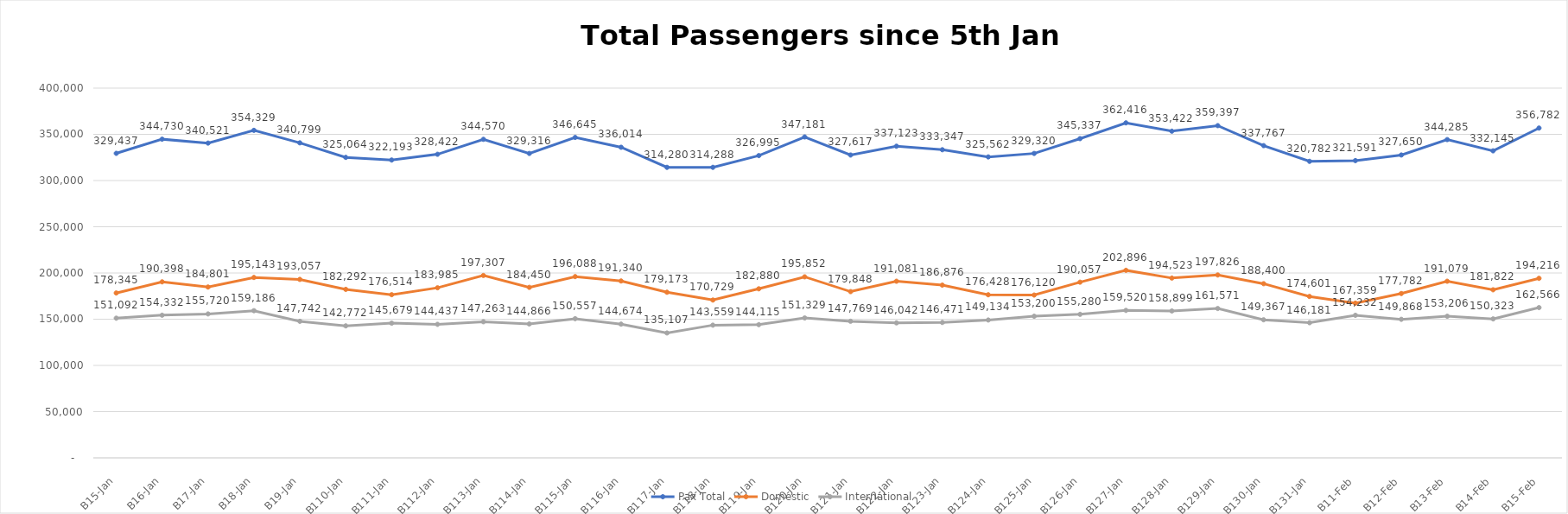
| Category | Pax Total |  Domestic  |  International  |
|---|---|---|---|
| 2023-01-05 | 329437 | 178345 | 151092 |
| 2023-01-06 | 344730 | 190398 | 154332 |
| 2023-01-07 | 340521 | 184801 | 155720 |
| 2023-01-08 | 354329 | 195143 | 159186 |
| 2023-01-09 | 340799 | 193057 | 147742 |
| 2023-01-10 | 325064 | 182292 | 142772 |
| 2023-01-11 | 322193 | 176514 | 145679 |
| 2023-01-12 | 328422 | 183985 | 144437 |
| 2023-01-13 | 344570 | 197307 | 147263 |
| 2023-01-14 | 329316 | 184450 | 144866 |
| 2023-01-15 | 346645 | 196088 | 150557 |
| 2023-01-16 | 336014 | 191340 | 144674 |
| 2023-01-17 | 314280 | 179173 | 135107 |
| 2023-01-18 | 314288 | 170729 | 143559 |
| 2023-01-19 | 326995 | 182880 | 144115 |
| 2023-01-20 | 347181 | 195852 | 151329 |
| 2023-01-21 | 327617 | 179848 | 147769 |
| 2023-01-22 | 337123 | 191081 | 146042 |
| 2023-01-23 | 333347 | 186876 | 146471 |
| 2023-01-24 | 325562 | 176428 | 149134 |
| 2023-01-25 | 329320 | 176120 | 153200 |
| 2023-01-26 | 345337 | 190057 | 155280 |
| 2023-01-27 | 362416 | 202896 | 159520 |
| 2023-01-28 | 353422 | 194523 | 158899 |
| 2023-01-29 | 359397 | 197826 | 161571 |
| 2023-01-30 | 337767 | 188400 | 149367 |
| 2023-01-31 | 320782 | 174601 | 146181 |
| 2023-02-01 | 321591 | 167359 | 154232 |
| 2023-02-02 | 327650 | 177782 | 149868 |
| 2023-02-03 | 344285 | 191079 | 153206 |
| 2023-02-04 | 332145 | 181822 | 150323 |
| 2023-02-05 | 356782 | 194216 | 162566 |